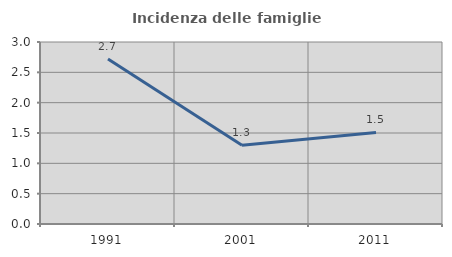
| Category | Incidenza delle famiglie numerose |
|---|---|
| 1991.0 | 2.72 |
| 2001.0 | 1.297 |
| 2011.0 | 1.509 |